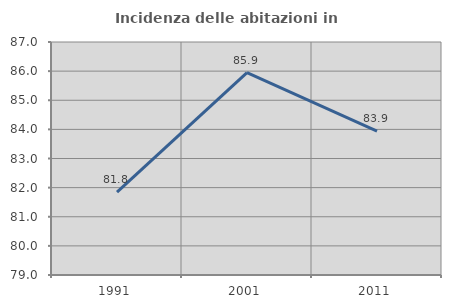
| Category | Incidenza delle abitazioni in proprietà  |
|---|---|
| 1991.0 | 81.842 |
| 2001.0 | 85.95 |
| 2011.0 | 83.937 |